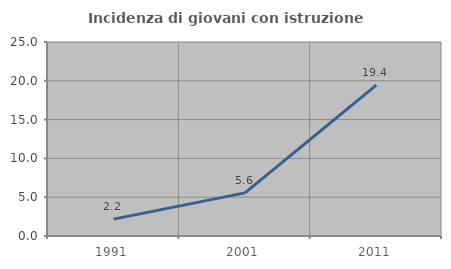
| Category | Incidenza di giovani con istruzione universitaria |
|---|---|
| 1991.0 | 2.174 |
| 2001.0 | 5.556 |
| 2011.0 | 19.444 |